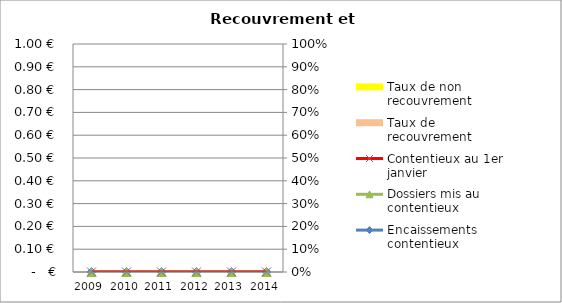
| Category | Taux de recouvrement | Taux de non recouvrement |
|---|---|---|
| 2009.0 | 0 | 0 |
| 2010.0 | 0 | 0 |
| 2011.0 | 0 | 0 |
| 2012.0 | 0 | 0 |
| 2013.0 | 0 | 0 |
| 2014.0 | 0 | 0 |